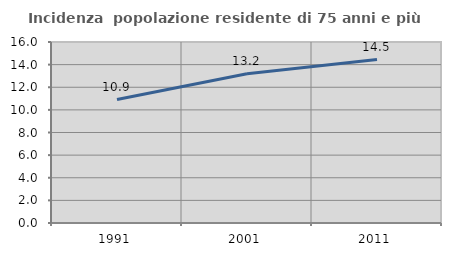
| Category | Incidenza  popolazione residente di 75 anni e più |
|---|---|
| 1991.0 | 10.913 |
| 2001.0 | 13.193 |
| 2011.0 | 14.45 |